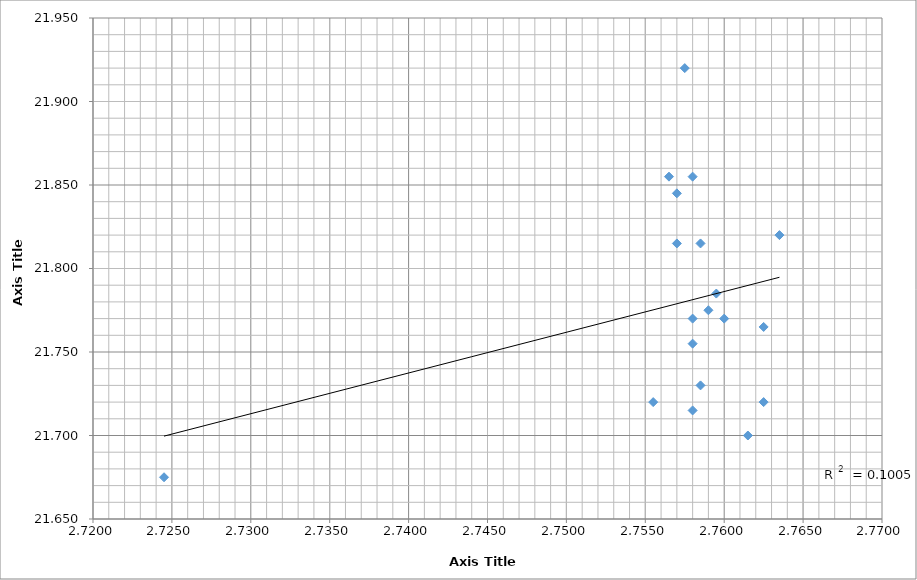
| Category | Wt(g) |
|---|---|
| 2.7615 | 21.675 |
| 2.758 | 21.7 |
| 2.7625 | 21.715 |
| 2.7555 | 21.72 |
| 2.7585 | 21.72 |
| 2.758 | 21.73 |
| 2.7625 | 21.755 |
| 2.76 | 21.765 |
| 2.758 | 21.77 |
| 2.759 | 21.77 |
| 2.7595 | 21.775 |
| 2.757 | 21.785 |
| 2.7585 | 21.815 |
| 2.7635 | 21.815 |
| 2.757 | 21.82 |
| 2.758 | 21.845 |
| 2.7565 | 21.855 |
| 2.7575 | 21.855 |
| 2.7575 | 21.92 |